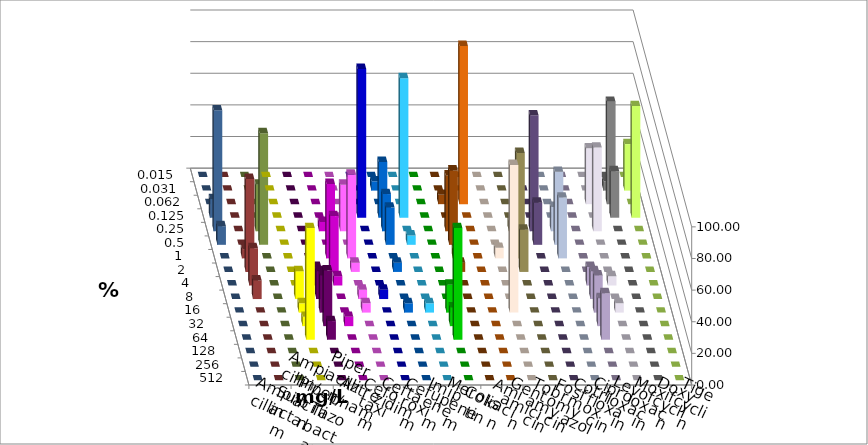
| Category | Ampicillin | Ampicillin/ Sulbactam | Piperacillin | Piperacillin/ Tazobactam | Aztreonam | Cefotaxim | Ceftazidim | Cefuroxim | Imipenem | Meropenem | Colistin | Amikacin | Gentamicin | Tobramycin | Fosfomycin | Cotrimoxazol | Ciprofloxacin | Levofloxacin | Moxifloxacin | Doxycyclin | Tigecyclin |
|---|---|---|---|---|---|---|---|---|---|---|---|---|---|---|---|---|---|---|---|---|---|
| 0.015 | 0 | 0 | 0 | 0 | 0 | 0 | 0 | 0 | 0 | 0 | 0 | 0 | 0 | 0 | 0 | 0 | 0 | 0 | 0 | 0 | 0 |
| 0.031 | 0 | 0 | 0 | 0 | 0 | 5.882 | 0 | 0 | 0 | 0 | 0 | 0 | 0 | 0 | 0 | 0 | 5.882 | 29.412 | 0 | 0 | 0 |
| 0.062 | 0 | 0 | 0 | 0 | 0 | 0 | 0 | 0 | 5.882 | 100 | 0 | 0 | 0 | 0 | 0 | 35.294 | 64.706 | 0 | 0 | 0 | 0 |
| 0.125 | 0 | 0 | 0 | 0 | 94.118 | 35.294 | 88.235 | 0 | 0 | 0 | 0 | 0 | 0 | 0 | 0 | 0 | 29.412 | 70.588 | 11.765 | 0 | 0 |
| 0.25 | 0 | 0 | 5.882 | 29.412 | 0 | 23.529 | 0 | 0 | 35.294 | 0 | 0 | 6.667 | 73.333 | 15.385 | 0 | 52.941 | 0 | 0 | 76.471 | 0 | 29.412 |
| 0.5 | 0 | 0 | 0 | 0 | 0 | 23.529 | 5.882 | 0 | 47.059 | 0 | 0 | 0 | 26.667 | 46.154 | 0 | 0 | 0 | 0 | 11.765 | 0 | 70.588 |
| 1.0 | 0 | 0 | 47.059 | 52.941 | 0 | 0 | 0 | 0 | 5.882 | 0 | 6.667 | 66.667 | 0 | 38.462 | 0 | 0 | 0 | 0 | 0 | 5.882 | 0 |
| 2.0 | 0 | 0 | 35.294 | 5.882 | 0 | 5.882 | 0 | 0 | 5.882 | 0 | 0 | 26.667 | 0 | 0 | 0 | 0 | 0 | 0 | 0 | 58.824 | 0 |
| 4.0 | 0 | 11.765 | 5.882 | 0 | 0 | 0 | 0 | 0 | 0 | 0 | 0 | 0 | 0 | 0 | 11.765 | 5.882 | 0 | 0 | 0 | 23.529 | 0 |
| 8.0 | 17.647 | 17.647 | 0 | 5.882 | 5.882 | 0 | 0 | 0 | 0 | 0 | 0 | 0 | 0 | 0 | 17.647 | 0 | 0 | 0 | 0 | 11.765 | 0 |
| 16.0 | 5.882 | 23.529 | 0 | 5.882 | 0 | 5.882 | 5.882 | 17.647 | 0 | 0 | 93.333 | 0 | 0 | 0 | 23.529 | 5.882 | 0 | 0 | 0 | 0 | 0 |
| 32.0 | 5.882 | 35.294 | 5.882 | 0 | 0 | 0 | 0 | 11.765 | 0 | 0 | 0 | 0 | 0 | 0 | 17.647 | 0 | 0 | 0 | 0 | 0 | 0 |
| 64.0 | 70.588 | 11.765 | 0 | 0 | 0 | 0 | 0 | 70.588 | 0 | 0 | 0 | 0 | 0 | 0 | 29.412 | 0 | 0 | 0 | 0 | 0 | 0 |
| 128.0 | 0 | 0 | 0 | 0 | 0 | 0 | 0 | 0 | 0 | 0 | 0 | 0 | 0 | 0 | 0 | 0 | 0 | 0 | 0 | 0 | 0 |
| 256.0 | 0 | 0 | 0 | 0 | 0 | 0 | 0 | 0 | 0 | 0 | 0 | 0 | 0 | 0 | 0 | 0 | 0 | 0 | 0 | 0 | 0 |
| 512.0 | 0 | 0 | 0 | 0 | 0 | 0 | 0 | 0 | 0 | 0 | 0 | 0 | 0 | 0 | 0 | 0 | 0 | 0 | 0 | 0 | 0 |